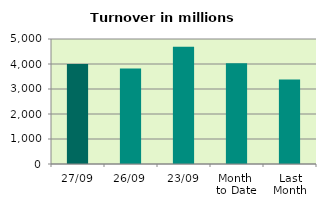
| Category | Series 0 |
|---|---|
| 27/09 | 4002.882 |
| 26/09 | 3824.579 |
| 23/09 | 4686.564 |
| Month 
to Date | 4025.171 |
| Last
Month | 3384.596 |